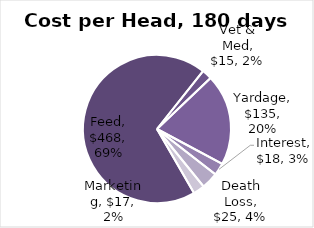
| Category | Cost per Head, 180 days |
|---|---|
| Feed | 468 |
| Vet & Med | 15 |
| Yardage | 135 |
| Interest | 18.402 |
| Death Loss | 24.721 |
| Marketing | 17 |